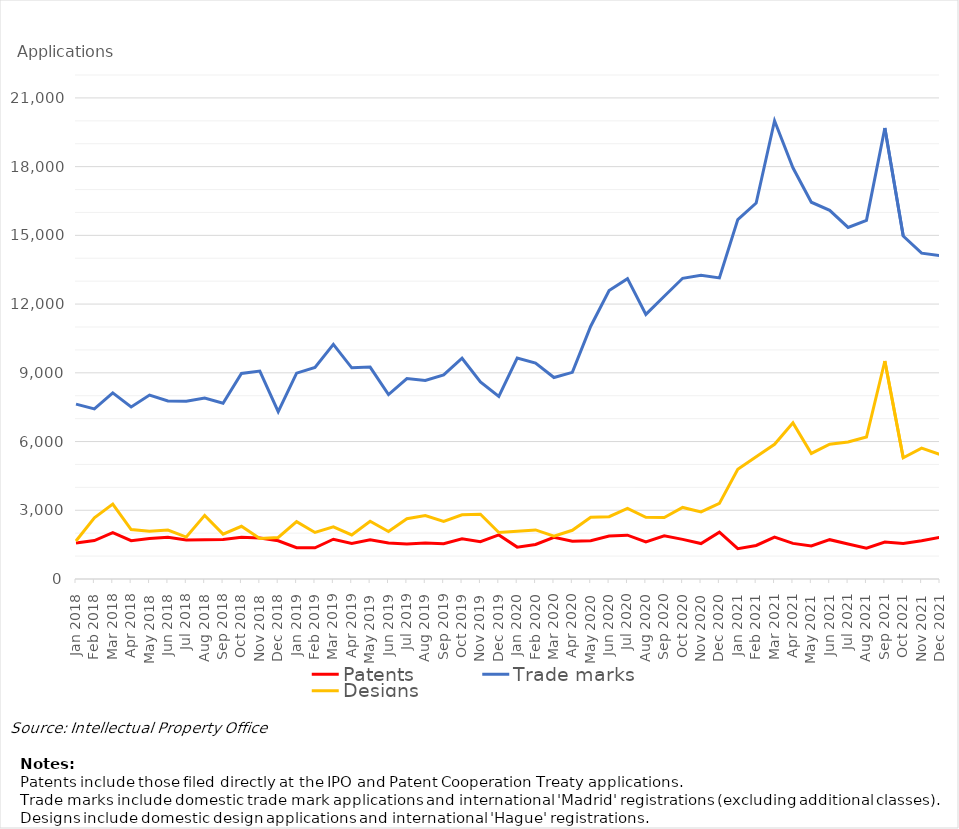
| Category | Patents | Trade marks | Designs |
|---|---|---|---|
| Jan 2018 | 1575 | 7634 | 1658 |
| Feb 2018 | 1676 | 7428 | 2672 |
| Mar 2018 | 2022 | 8127 | 3267 |
| Apr 2018 | 1670 | 7512 | 2160 |
| May 2018 | 1767 | 8030 | 2083 |
| Jun 2018 | 1821 | 7769 | 2136 |
| Jul 2018 | 1704 | 7757 | 1832 |
| Aug 2018 | 1713 | 7897 | 2777 |
| Sep 2018 | 1725 | 7673 | 1960 |
| Oct 2018 | 1818 | 8972 | 2302 |
| Nov 2018 | 1787 | 9076 | 1765 |
| Dec 2018 | 1670 | 7304 | 1815 |
| Jan 2019 | 1367 | 8985 | 2505 |
| Feb 2019 | 1361 | 9234 | 2031 |
| Mar 2019 | 1737 | 10243 | 2274 |
| Apr 2019 | 1552 | 9219 | 1923 |
| May 2019 | 1710 | 9251 | 2520 |
| Jun 2019 | 1569 | 8053 | 2074 |
| Jul 2019 | 1527 | 8752 | 2634 |
| Aug 2019 | 1571 | 8670 | 2768 |
| Sep 2019 | 1540 | 8907 | 2511 |
| Oct 2019 | 1755 | 9636 | 2800 |
| Nov 2019 | 1630 | 8607 | 2827 |
| Dec 2019 | 1926 | 7970 | 2028 |
| Jan 2020 | 1392 | 9642 | 2082 |
| Feb 2020 | 1506 | 9428 | 2143 |
| Mar 2020 | 1819 | 8794 | 1871 |
| Apr 2020 | 1648 | 9021 | 2127 |
| May 2020 | 1672 | 11035 | 2695 |
| Jun 2020 | 1880 | 12593 | 2721 |
| Jul 2020 | 1912 | 13110 | 3086 |
| Aug 2020 | 1616 | 11551 | 2694 |
| Sep 2020 | 1886 | 12340 | 2686 |
| Oct 2020 | 1731 | 13126 | 3124 |
| Nov 2020 | 1548 | 13254 | 2930 |
| Dec 2020 | 2043 | 13144 | 3302 |
| Jan 2021 | 1326 | 15685 | 4792 |
| Feb 2021 | 1463 | 16412 | 5341 |
| Mar 2021 | 1826 | 20001 | 5879 |
| Apr 2021 | 1554 | 17951 | 6815 |
| May 2021 | 1446 | 16446 | 5480 |
| Jun 2021 | 1717 | 16091 | 5882 |
| Jul 2021 | 1528 | 15345 | 5982 |
| Aug 2021 | 1348 | 15658 | 6199 |
| Sep 2021 | 1611 | 19685 | 9515 |
| Oct 2021 | 1546 | 14968 | 5289 |
| Nov 2021 | 1668 | 14225 | 5711 |
| Dec 2021 | 1824 | 14110 | 5437 |